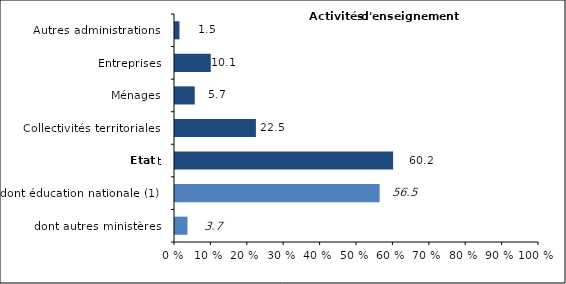
| Category | Series 0 |
|---|---|
| dont autres ministères | 3.7 |
| dont éducation nationale (1) | 56.5 |
| État | 60.2 |
| Collectivités territoriales | 22.5 |
| Ménages | 5.7 |
|  Entreprises | 10.1 |
| Autres administrations | 1.5 |